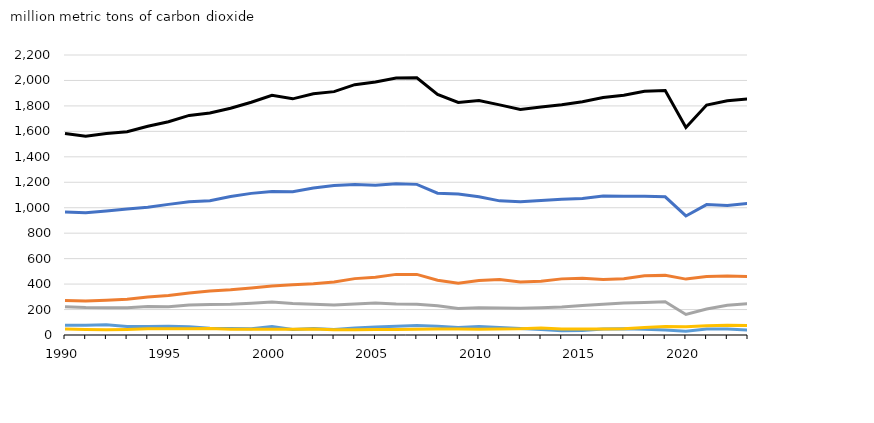
| Category | Series 0 | Series 1 | Series 2 | Series 3 | Series 4 | Series 5 |
|---|---|---|---|---|---|---|
| 1990 | 966.8 | 270.765 | 222.611 | 76.295 | 47.069 | 1583.54 |
| 1991 | 960.482 | 266.29 | 215.179 | 77.04 | 42.916 | 1561.907 |
| 1992 | 973.932 | 272.45 | 213.385 | 80.348 | 42.227 | 1582.342 |
| 1993 | 989.533 | 280.726 | 215.059 | 67.693 | 44.138 | 1597.149 |
| 1994 | 1003.34 | 297.937 | 223.812 | 66.277 | 48.668 | 1640.034 |
| 1995 | 1026.384 | 309.981 | 222.114 | 68.374 | 48.468 | 1675.321 |
| 1996 | 1046.05 | 330.253 | 236.473 | 63.927 | 48.684 | 1725.387 |
| 1997 | 1055.42 | 345.249 | 238.923 | 53.445 | 51.402 | 1744.439 |
| 1998 | 1087.898 | 355.478 | 242.434 | 50.591 | 45.528 | 1781.929 |
| 1999 | 1112.777 | 369.478 | 250.018 | 49.971 | 46.16 | 1828.404 |
| 2000 | 1127.539 | 385.72 | 258.581 | 66.648 | 45.55 | 1884.038 |
| 2001 | 1125.28 | 394.636 | 247.432 | 43.97 | 44.251 | 1855.569 |
| 2002 | 1154.548 | 402.145 | 241.245 | 50.824 | 46.331 | 1895.093 |
| 2003 | 1174.256 | 417.065 | 235.839 | 42.873 | 42.039 | 1912.072 |
| 2004 | 1183.096 | 442.977 | 244.294 | 55.532 | 40.923 | 1966.822 |
| 2005 | 1177.443 | 453.238 | 250.954 | 62.886 | 42.901 | 1987.422 |
| 2006 | 1187.527 | 476.333 | 244.066 | 68.01 | 42.634 | 2018.57 |
| 2007 | 1183.524 | 476.048 | 242.494 | 74.616 | 44.384 | 2021.066 |
| 2008 | 1114.063 | 430.065 | 230.594 | 69.531 | 46.419 | 1890.672 |
| 2009 | 1107.038 | 406.026 | 208.237 | 59.362 | 46.233 | 1826.896 |
| 2010 | 1086.273 | 428.98 | 214.018 | 66.982 | 46.06 | 1842.313 |
| 2011 | 1053.942 | 436.356 | 213.075 | 58.297 | 46.601 | 1808.271 |
| 2012 | 1046.507 | 416.749 | 209.58 | 50.352 | 48.408 | 1771.596 |
| 2013 | 1057.435 | 421.432 | 214.429 | 43.641 | 54.281 | 1791.218 |
| 2014 | 1067.444 | 440.992 | 219.74 | 33.532 | 47.763 | 1809.471 |
| 2015 | 1072.707 | 446.801 | 231.448 | 34.798 | 47.529 | 1833.283 |
| 2016 | 1091.65 | 437.047 | 241.973 | 46.792 | 47.938 | 1865.4 |
| 2017 | 1090.142 | 442.065 | 251.469 | 49.906 | 49.739 | 1883.321 |
| 2018 | 1089.598 | 466.169 | 255.183 | 45.359 | 58.323 | 1914.632 |
| 2019 | 1085.924 | 468.479 | 260.619 | 39.732 | 66.214 | 1920.968 |
| 2020 | 935.389 | 439.201 | 161.358 | 29.396 | 64.882 | 1630.226 |
| 2021 | 1024.604 | 459.304 | 204.785 | 46.172 | 71.709 | 1806.574 |
| 2022 | 1018.014 | 464.457 | 233.162 | 47.313 | 76.955 | 1839.901 |
| 2023 | 1033.452 | 460.411 | 246.927 | 39.316 | 75.512 | 1855.618 |